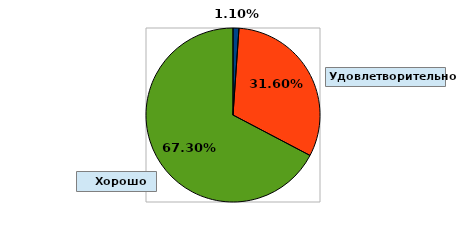
| Category | Series 0 |
|---|---|
| 0 | 0.011 |
| 1 | 0.316 |
| 2 | 0.673 |